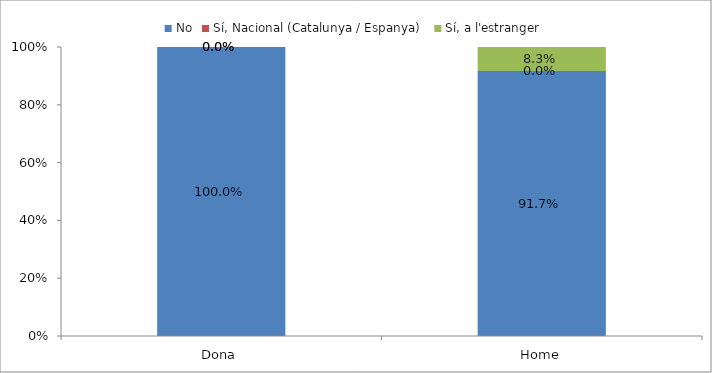
| Category | No | Sí, Nacional (Catalunya / Espanya) | Sí, a l'estranger |
|---|---|---|---|
| Dona | 1 | 0 | 0 |
| Home | 0.917 | 0 | 0.083 |